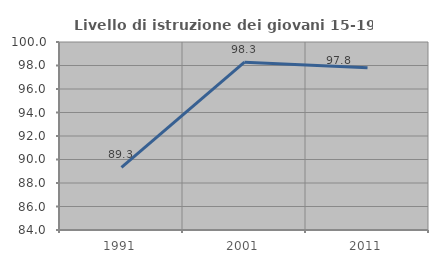
| Category | Livello di istruzione dei giovani 15-19 anni |
|---|---|
| 1991.0 | 89.328 |
| 2001.0 | 98.286 |
| 2011.0 | 97.81 |